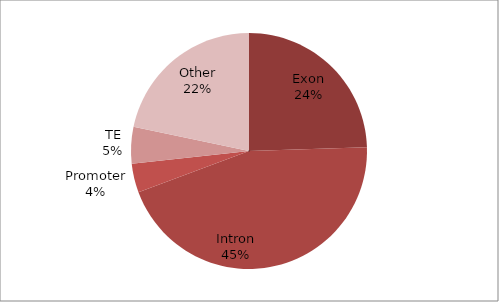
| Category | mCG |
|---|---|
| Exon | 356323 |
| Intron | 651253 |
| Promoter | 57498 |
| TE | 73083 |
| Other | 315596 |